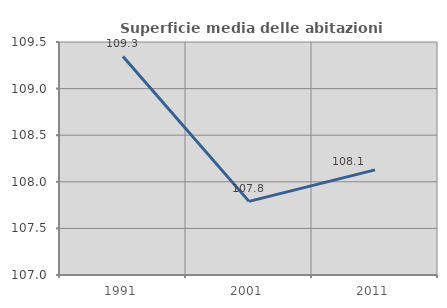
| Category | Superficie media delle abitazioni occupate |
|---|---|
| 1991.0 | 109.345 |
| 2001.0 | 107.79 |
| 2011.0 | 108.128 |